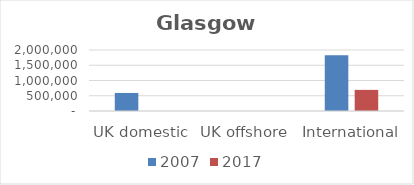
| Category | 2007 | 2017 |
|---|---|---|
| UK domestic | 591623 | 630 |
| UK offshore | 0 | 0 |
| International | 1825978 | 692209 |